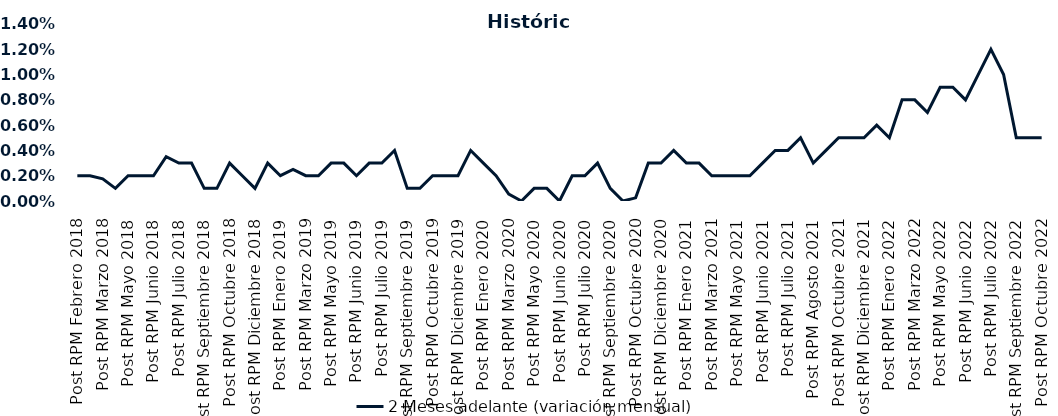
| Category | 2 Meses adelante (variación mensual) |
|---|---|
| Post RPM Febrero 2018 | 0.002 |
| Pre RPM Marzo 2018 | 0.002 |
| Post RPM Marzo 2018 | 0.002 |
| Pre RPM Mayo 2018 | 0.001 |
| Post RPM Mayo 2018 | 0.002 |
| Pre RPM Junio 2018 | 0.002 |
| Post RPM Junio 2018 | 0.002 |
| Pre RPM Julio 2018 | 0.004 |
| Post RPM Julio 2018 | 0.003 |
| Pre RPM Septiembre 2018 | 0.003 |
| Post RPM Septiembre 2018 | 0.001 |
| Pre RPM Octubre 2018 | 0.001 |
| Post RPM Octubre 2018 | 0.003 |
| Pre RPM Diciembre 2018 | 0.002 |
| Post RPM Diciembre 2018 | 0.001 |
| Pre RPM Enero 2019 | 0.003 |
| Post RPM Enero 2019 | 0.002 |
| Pre RPM Marzo 2019 | 0.002 |
| Post RPM Marzo 2019 | 0.002 |
| Pre RPM Mayo 2019 | 0.002 |
| Post RPM Mayo 2019 | 0.003 |
| Pre RPM Junio 2019 | 0.003 |
| Post RPM Junio 2019 | 0.002 |
| Pre RPM Julio 2019 | 0.003 |
| Post RPM Julio 2019 | 0.003 |
| Pre RPM Septiembre 2019 | 0.004 |
| Post RPM Septiembre 2019 | 0.001 |
| Pre RPM Octubre 2019 | 0.001 |
| Post RPM Octubre 2019 | 0.002 |
| Pre RPM Diciembre 2019 | 0.002 |
| Post RPM Diciembre 2019 | 0.002 |
| Pre RPM Enero 2020 | 0.004 |
| Post RPM Enero 2020 | 0.003 |
| Pre RPM Marzo 2020 | 0.002 |
| Post RPM Marzo 2020 | 0.001 |
| Pre RPM Mayo 2020 | 0 |
| Post RPM Mayo 2020 | 0.001 |
| Pre RPM Junio 2020 | 0.001 |
| Post RPM Junio 2020 | 0 |
| Pre RPM Julio 2020 | 0.002 |
| Post RPM Julio 2020 | 0.002 |
| Pre RPM Septiembre 2020 | 0.003 |
| Post RPM Septiembre 2020 | 0.001 |
| Pre RPM Octubre 2020 | 0 |
| Post RPM Octubre 2020 | 0 |
| Pre RPM Diciembre 2020 | 0.003 |
| Post RPM Diciembre 2020 | 0.003 |
| Pre RPM Enero 2021 | 0.004 |
| Post RPM Enero 2021 | 0.003 |
| Pre RPM Marzo 2021 | 0.003 |
| Post RPM Marzo 2021 | 0.002 |
| Pre RPM Mayo 2021 | 0.002 |
| Post RPM Mayo 2021 | 0.002 |
| Pre RPM Junio 2021 | 0.002 |
| Post RPM Junio 2021 | 0.003 |
| Pre RPM Julio 2021 | 0.004 |
| Post RPM Julio 2021 | 0.004 |
| Pre RPM Agosto 2021 | 0.005 |
| Post RPM Agosto 2021 | 0.003 |
| Pre RPM Octubre 2021 | 0.004 |
| Post RPM Octubre 2021 | 0.005 |
| Pre RPM Diciembre 2021 | 0.005 |
| Post RPM Diciembre 2021 | 0.005 |
| Pre RPM Enero 2022 | 0.006 |
| Post RPM Enero 2022 | 0.005 |
| Pre RPM Marzo 2022 | 0.008 |
| Post RPM Marzo 2022 | 0.008 |
| Pre RPM Mayo 2022 | 0.007 |
| Post RPM Mayo 2022 | 0.009 |
| Pre RPM Junio 2022 | 0.009 |
| Post RPM Junio 2022 | 0.008 |
| Pre RPM Julio 2022 | 0.01 |
| Post RPM Julio 2022 | 0.012 |
| Pre RPM Septiembre 2022 | 0.01 |
| Post RPM Septiembre 2022 | 0.005 |
| Pre RPM Octubre 2022 | 0.005 |
| Post RPM Octubre 2022 | 0.005 |